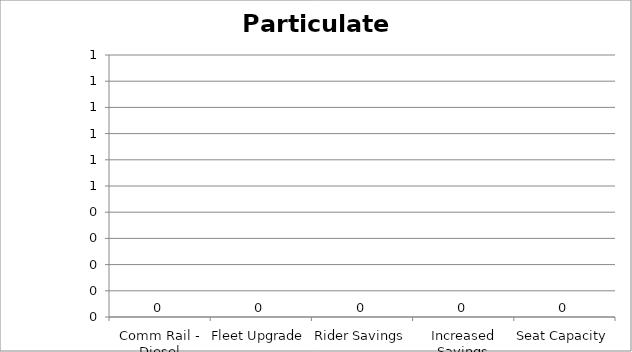
| Category | Particulate Matter |
|---|---|
| Comm Rail - Diesel | 0 |
| Fleet Upgrade | 0 |
| Rider Savings | 0 |
| Increased Savings | 0 |
| Seat Capacity | 0 |